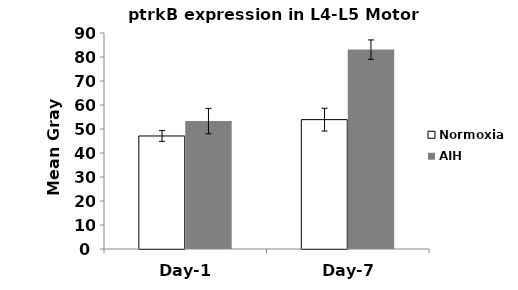
| Category | Normoxia | AIH |
|---|---|---|
| 0 | 47.095 | 53.294 |
| 1 | 53.904 | 83.078 |